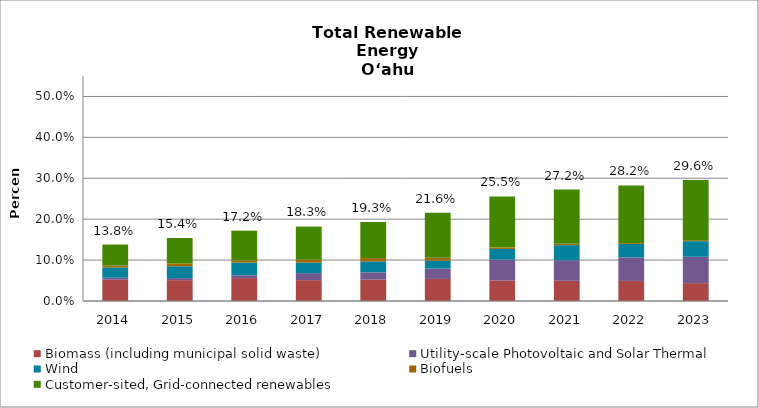
| Category | Biomass (including municipal solid waste) | Utility-scale Photovoltaic and Solar Thermal | Wind | Biofuels | Customer-sited, Grid-connected renewables |
|---|---|---|---|---|---|
| 2014.0 | 0.052 | 0.005 | 0.025 | 0.005 | 0.051 |
| 2015.0 | 0.051 | 0.005 | 0.029 | 0.007 | 0.062 |
| 2016.0 | 0.056 | 0.007 | 0.031 | 0.005 | 0.073 |
| 2017.0 | 0.051 | 0.017 | 0.026 | 0.007 | 0.081 |
| 2018.0 | 0.052 | 0.018 | 0.027 | 0.008 | 0.088 |
| 2019.0 | 0.054 | 0.025 | 0.019 | 0.007 | 0.11 |
| 2020.0 | 0.05 | 0.051 | 0.026 | 0.004 | 0.124 |
| 2021.0 | 0.049 | 0.05 | 0.037 | 0.003 | 0.133 |
| 2022.0 | 0.049 | 0.057 | 0.033 | 0.002 | 0.141 |
| 2023.0 | 0.044 | 0.064 | 0.038 | 0.002 | 0.147 |